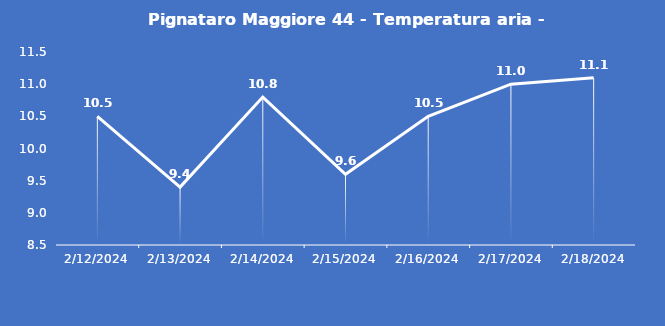
| Category | Pignataro Maggiore 44 - Temperatura aria - Grezzo (°C) |
|---|---|
| 2/12/24 | 10.5 |
| 2/13/24 | 9.4 |
| 2/14/24 | 10.8 |
| 2/15/24 | 9.6 |
| 2/16/24 | 10.5 |
| 2/17/24 | 11 |
| 2/18/24 | 11.1 |